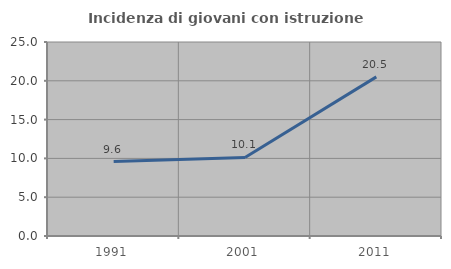
| Category | Incidenza di giovani con istruzione universitaria |
|---|---|
| 1991.0 | 9.589 |
| 2001.0 | 10.125 |
| 2011.0 | 20.505 |